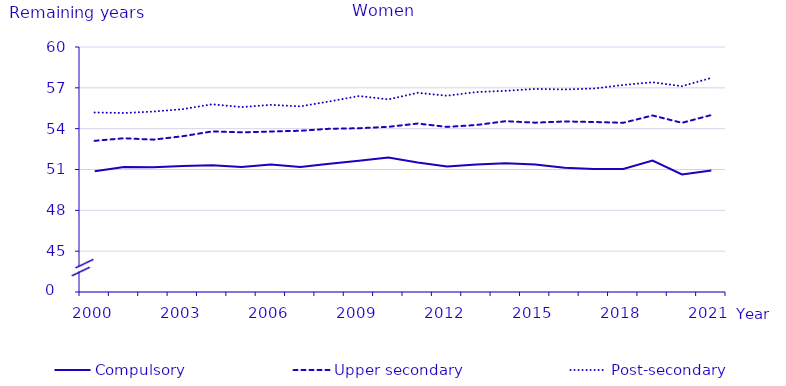
| Category | Compulsory | Upper secondary | Post-secondary |
|---|---|---|---|
| 2000.0 | 50.875 | 53.108 | 55.187 |
| 2001.0 | 51.177 | 53.296 | 55.151 |
| 2002.0 | 51.161 | 53.193 | 55.256 |
| 2003.0 | 51.259 | 53.446 | 55.434 |
| 2004.0 | 51.313 | 53.797 | 55.792 |
| 2005.0 | 51.176 | 53.728 | 55.586 |
| 2006.0 | 51.361 | 53.793 | 55.749 |
| 2007.0 | 51.188 | 53.845 | 55.637 |
| 2008.0 | 51.414 | 53.993 | 56.003 |
| 2009.0 | 51.651 | 54.031 | 56.399 |
| 2010.0 | 51.886 | 54.134 | 56.151 |
| 2011.0 | 51.511 | 54.375 | 56.635 |
| 2012.0 | 51.22 | 54.13 | 56.42 |
| 2013.0 | 51.37 | 54.27 | 56.69 |
| 2014.0 | 51.45 | 54.55 | 56.78 |
| 2015.0 | 51.36 | 54.44 | 56.92 |
| 2016.0 | 51.12 | 54.53 | 56.88 |
| 2017.0 | 51.03 | 54.49 | 56.95 |
| 2018.0 | 51.04 | 54.43 | 57.21 |
| 2019.0 | 51.66 | 54.97 | 57.41 |
| 2020.0 | 50.64 | 54.43 | 57.12 |
| 2021.0 | 50.92 | 55 | 57.73 |